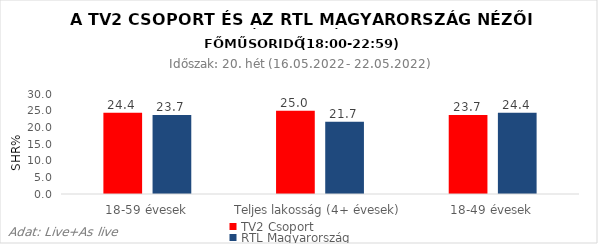
| Category | TV2 Csoport | RTL Magyarország |
|---|---|---|
| 18-59 évesek | 24.4 | 23.7 |
| Teljes lakosság (4+ évesek) | 25 | 21.7 |
| 18-49 évesek | 23.7 | 24.4 |